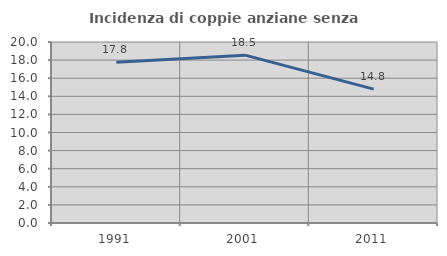
| Category | Incidenza di coppie anziane senza figli  |
|---|---|
| 1991.0 | 17.77 |
| 2001.0 | 18.548 |
| 2011.0 | 14.798 |